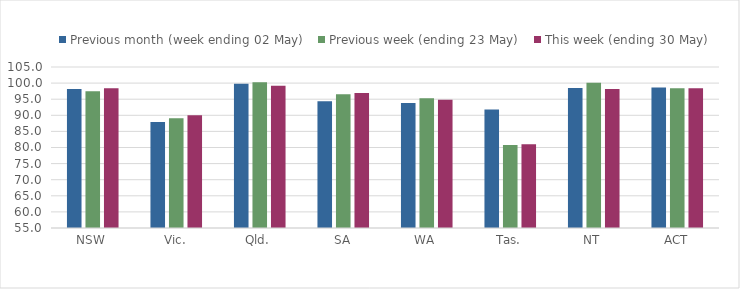
| Category | Previous month (week ending 02 May) | Previous week (ending 23 May) | This week (ending 30 May) |
|---|---|---|---|
| NSW | 98.184 | 97.48 | 98.399 |
| Vic. | 87.957 | 89.059 | 89.978 |
| Qld. | 99.836 | 100.267 | 99.171 |
| SA | 94.391 | 96.541 | 96.932 |
| WA | 93.853 | 95.3 | 94.863 |
| Tas. | 91.779 | 80.796 | 81.043 |
| NT | 98.498 | 100.14 | 98.167 |
| ACT | 98.67 | 98.4 | 98.369 |